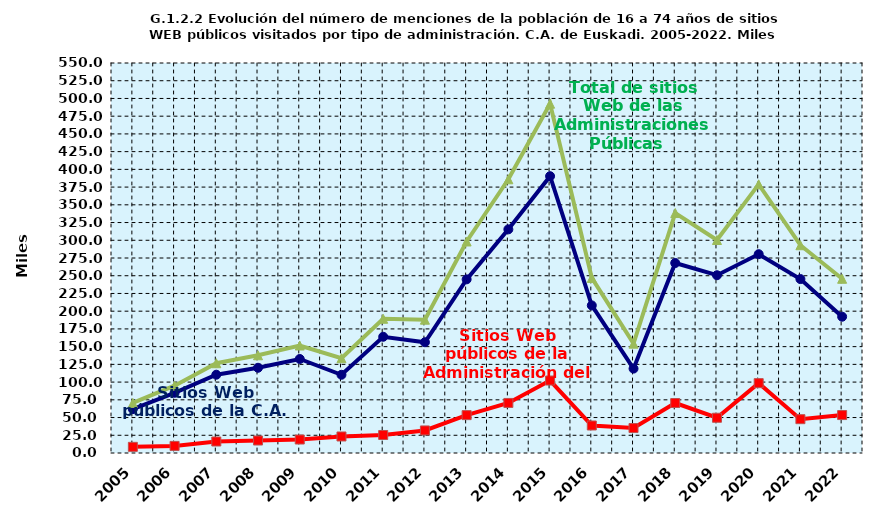
| Category | Sitios Web públicos de la C.A. de Euskadi | Sitios Web públicos de la Administración del Estado | Total de sitios Web de las Administraciones Públicas |
|---|---|---|---|
| 2005.0 | 61.9 | 8.7 | 70.6 |
| 2006.0 | 84.9 | 10 | 94.9 |
| 2007.0 | 110.4 | 16.2 | 126.6 |
| 2008.0 | 120.2 | 17.6 | 137.8 |
| 2009.0 | 132.6 | 19 | 151.6 |
| 2010.0 | 110.3 | 23.3 | 133.6 |
| 2011.0 | 163.9 | 25.4 | 189.3 |
| 2012.0 | 156.2 | 31.8 | 188 |
| 2013.0 | 244.9 | 53.4 | 298.3 |
| 2014.0 | 315.4 | 70.6 | 386 |
| 2015.0 | 390.4 | 102.2 | 492.6 |
| 2016.0 | 208.1 | 38.8 | 246.9 |
| 2017.0 | 119 | 35.2 | 154.2 |
| 2018.0 | 267.9 | 70.5 | 338.4 |
| 2019.0 | 250.7 | 49.7 | 300.4 |
| 2020.0 | 280.4 | 98.5 | 378.9 |
| 2021.0 | 245.3 | 47.7 | 293 |
| 2022.0 | 192.2 | 53.5 | 245.7 |